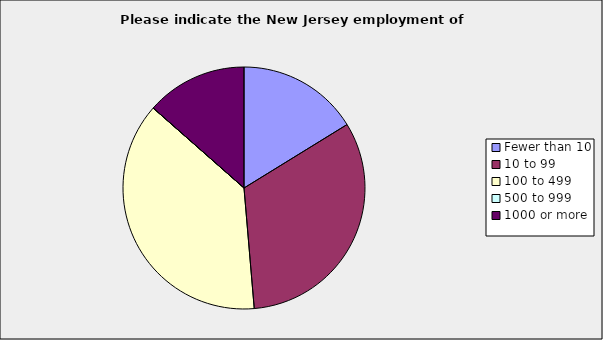
| Category | Series 0 |
|---|---|
| Fewer than 10 | 0.162 |
| 10 to 99 | 0.324 |
| 100 to 499 | 0.378 |
| 500 to 999 | 0 |
| 1000 or more | 0.135 |